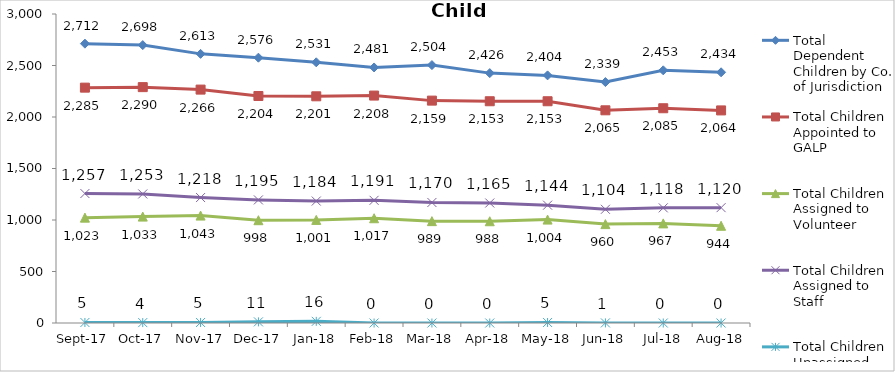
| Category | Total Dependent Children by Co. of Jurisdiction | Total Children Appointed to GALP | Total Children Assigned to Volunteer | Total Children Assigned to Staff | Total Children Unassigned |
|---|---|---|---|---|---|
| 2017-09-01 | 2712 | 2285 | 1023 | 1257 | 5 |
| 2017-10-01 | 2698 | 2290 | 1033 | 1253 | 4 |
| 2017-11-01 | 2613 | 2266 | 1043 | 1218 | 5 |
| 2017-12-01 | 2576 | 2204 | 998 | 1195 | 11 |
| 2018-01-01 | 2531 | 2201 | 1001 | 1184 | 16 |
| 2018-02-01 | 2481 | 2208 | 1017 | 1191 | 0 |
| 2018-03-01 | 2504 | 2159 | 989 | 1170 | 0 |
| 2018-04-01 | 2426 | 2153 | 988 | 1165 | 0 |
| 2018-05-01 | 2404 | 2153 | 1004 | 1144 | 5 |
| 2018-06-01 | 2339 | 2065 | 960 | 1104 | 1 |
| 2018-07-01 | 2453 | 2085 | 967 | 1118 | 0 |
| 2018-08-01 | 2434 | 2064 | 944 | 1120 | 0 |